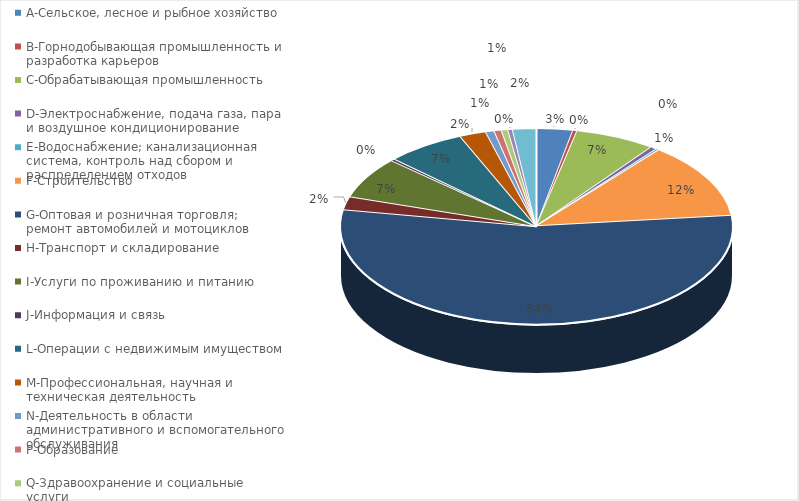
| Category | Series 0 |
|---|---|
| A-Сельское, лесное и рыбное хозяйство | 0.03 |
| B-Горнодобывающая промышленность и разработка карьеров | 0.004 |
| C-Обрабатывающая промышленность | 0.066 |
| D-Электроснабжение, подача газа, пара и воздушное кондиционирование | 0.005 |
| E-Водоснабжение; канализационная система, контроль над сбором и распределением отходов | 0.003 |
| F-Строительство | 0.125 |
| G-Оптовая и розничная торговля; ремонт автомобилей и мотоциклов | 0.545 |
| H-Транспорт и складирование | 0.022 |
| I-Услуги по проживанию и питанию | 0.068 |
| J-Информация и связь | 0.003 |
| L-Операции с недвижимым имуществом | 0.065 |
| M-Профессиональная, научная и техническая деятельность | 0.022 |
| N-Деятельность в области административного и вспомогательного обслуживания | 0.007 |
| P-Образование | 0.006 |
| Q-Здравоохранение и социальные услуги | 0.005 |
| R-Искусство, развлечения и отдых | 0.004 |
| S-Предоставление прочих видов услуг | 0.019 |